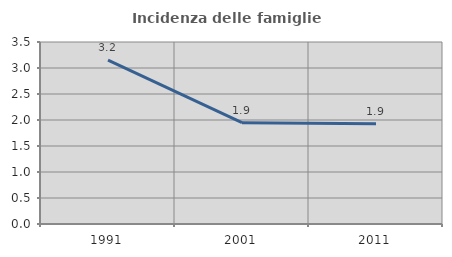
| Category | Incidenza delle famiglie numerose |
|---|---|
| 1991.0 | 3.151 |
| 2001.0 | 1.949 |
| 2011.0 | 1.928 |